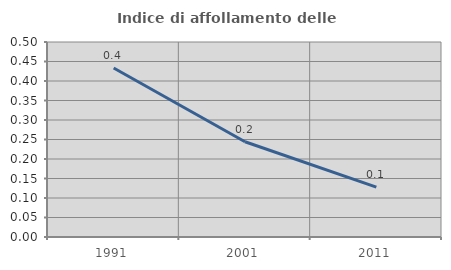
| Category | Indice di affollamento delle abitazioni  |
|---|---|
| 1991.0 | 0.433 |
| 2001.0 | 0.244 |
| 2011.0 | 0.128 |